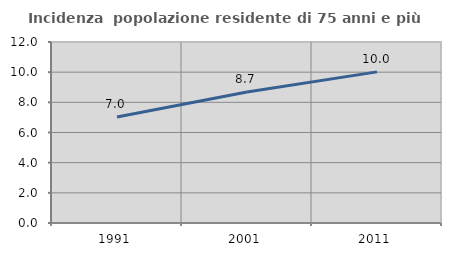
| Category | Incidenza  popolazione residente di 75 anni e più |
|---|---|
| 1991.0 | 7.033 |
| 2001.0 | 8.682 |
| 2011.0 | 10.019 |